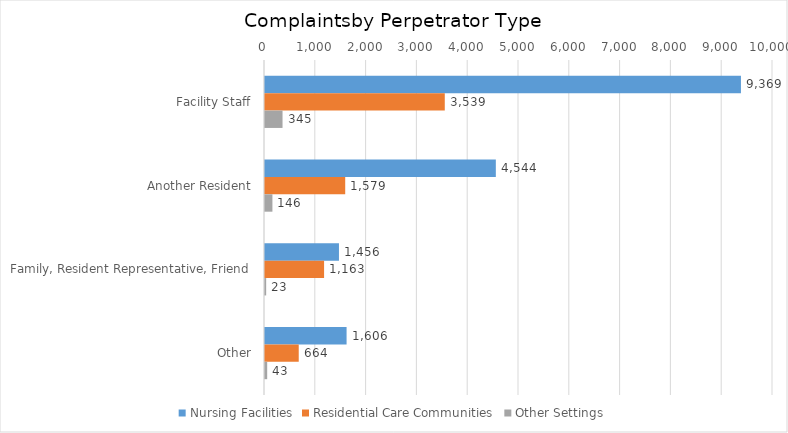
| Category | Nursing Facilities | Residential Care Communities | Other Settings |
|---|---|---|---|
| Facility Staff | 9369 | 3539 | 345 |
| Another Resident | 4544 | 1579 | 146 |
| Family, Resident Representative, Friend | 1456 | 1163 | 23 |
| Other | 1606 | 664 | 43 |